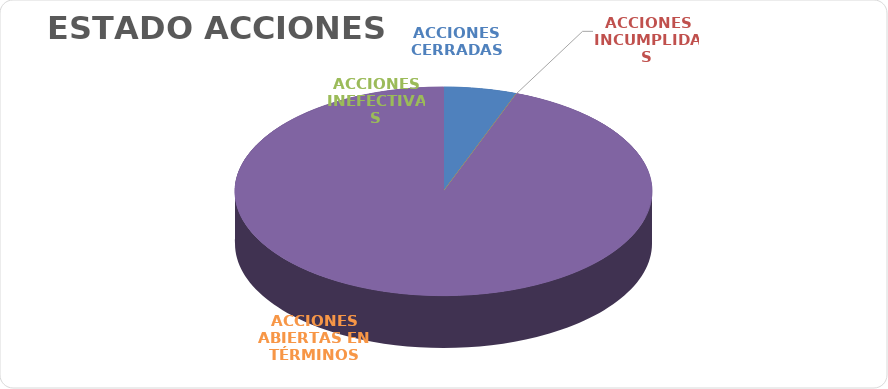
| Category | Series 0 |
|---|---|
| ACCIONES CERRADAS | 7 |
| ACCIONES INCUMPLIDAS | 0 |
| ACCIONES INEFECTIVAS | 0 |
| ACCIONES ABIERTAS EN TÉRMINOS | 116 |